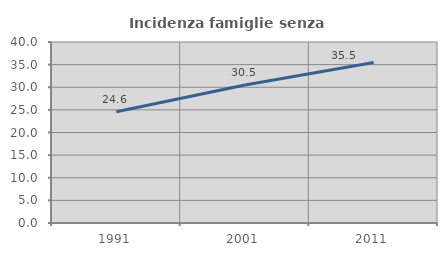
| Category | Incidenza famiglie senza nuclei |
|---|---|
| 1991.0 | 24.575 |
| 2001.0 | 30.49 |
| 2011.0 | 35.484 |